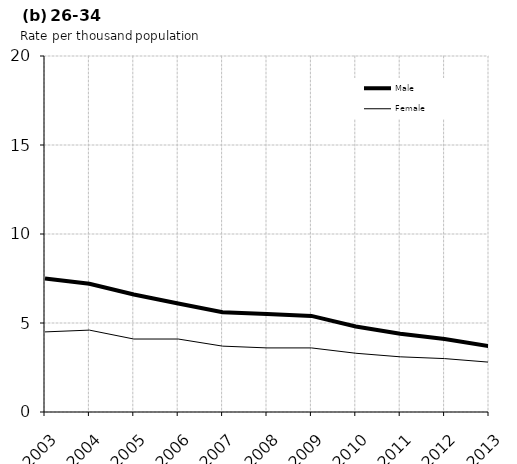
| Category | Male | Female |
|---|---|---|
| 2003.0 | 7.5 | 4.5 |
| 2004.0 | 7.2 | 4.6 |
| 2005.0 | 6.6 | 4.1 |
| 2006.0 | 6.1 | 4.1 |
| 2007.0 | 5.6 | 3.7 |
| 2008.0 | 5.5 | 3.6 |
| 2009.0 | 5.4 | 3.6 |
| 2010.0 | 4.8 | 3.3 |
| 2011.0 | 4.4 | 3.1 |
| 2012.0 | 4.1 | 3 |
| 2013.0 | 3.7 | 2.8 |